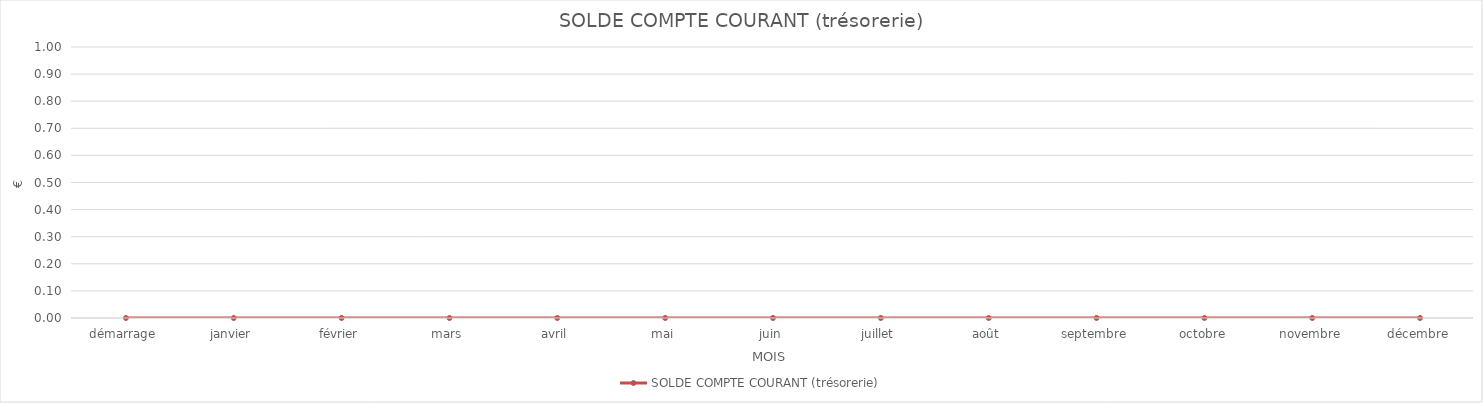
| Category | SOLDE COMPTE COURANT (trésorerie) |
|---|---|
| démarrage | 0 |
| janvier | 0 |
| février | 0 |
| mars | 0 |
| avril | 0 |
| mai | 0 |
| juin | 0 |
| juillet | 0 |
| août | 0 |
| septembre | 0 |
| octobre | 0 |
| novembre | 0 |
| décembre | 0 |